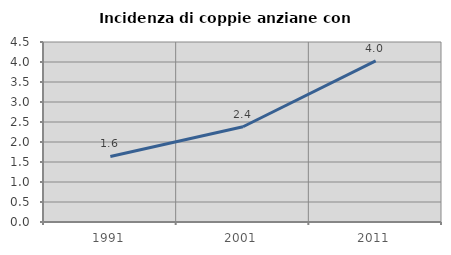
| Category | Incidenza di coppie anziane con figli |
|---|---|
| 1991.0 | 1.639 |
| 2001.0 | 2.381 |
| 2011.0 | 4.027 |